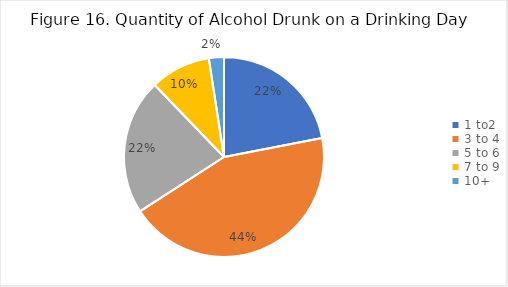
| Category | Series 0 |
|---|---|
| 1 to2 | 0.22 |
| 3 to 4 | 0.439 |
| 5 to 6 | 0.22 |
| 7 to 9 | 0.098 |
| 10+ | 0.024 |